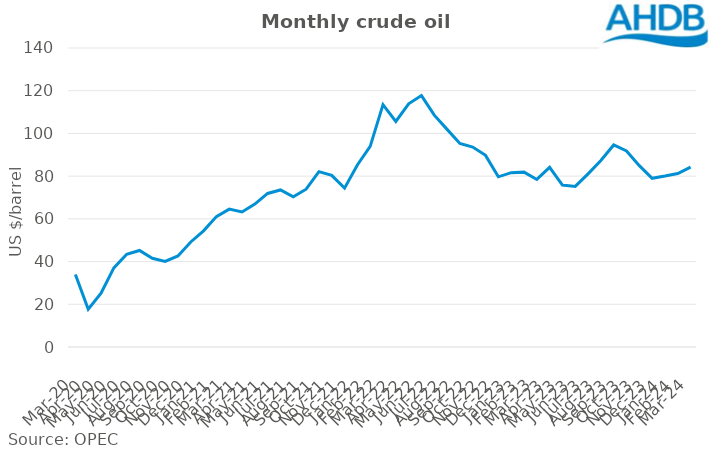
| Category | Crude oil ($/barrel) |
|---|---|
| Mar-20 | 33.92 |
| Apr-20 | 17.66 |
| May-20 | 25.17 |
| Jun-20 | 37.05 |
| Jul-20 | 43.42 |
| Aug-20 | 45.19 |
| Sep-20 | 41.54 |
| Oct-20 | 40.08 |
| Nov-20 | 42.61 |
| Dec-20 | 49.17 |
| Jan-21 | 54.38 |
| Feb-21 | 61.05 |
| Mar-21 | 64.56 |
| Apr-21 | 63.24 |
| May-21 | 66.91 |
| Jun-21 | 71.89 |
| Jul-21 | 73.53 |
| Aug-21 | 70.33 |
| Sep-21 | 73.88 |
| Oct-21 | 82.11 |
| Nov-21 | 80.37 |
| Dec-21 | 74.38 |
| Jan-22 | 85.24 |
| Feb-22 | 93.95 |
| Mar-22 | 113.48 |
| Apr-22 | 105.64 |
| May-22 | 113.87 |
| Jun-22 | 117.72 |
| Jul-22 | 108.55 |
| Aug-22 | 101.9 |
| Sep-22 | 95.32 |
| Oct-22 | 93.62 |
| Nov-22 | 89.73 |
| Dec-22 | 79.68 |
| Jan-23 | 81.62 |
| Feb-23 | 81.88 |
| Mar-23 | 78.45 |
| Apr-23 | 84.13 |
| May-23 | 75.82 |
| Jun-23 | 75.19 |
| Jul-23 | 81.06 |
| Aug-23 | 87.33 |
| Sep-23 | 94.6 |
| Oct-23 | 91.78 |
| Nov-23 | 84.92 |
| Dec-23 | 79 |
| Jan-24 | 80.04 |
| Feb-24 | 81.23 |
| Mar-24 | 84.22 |